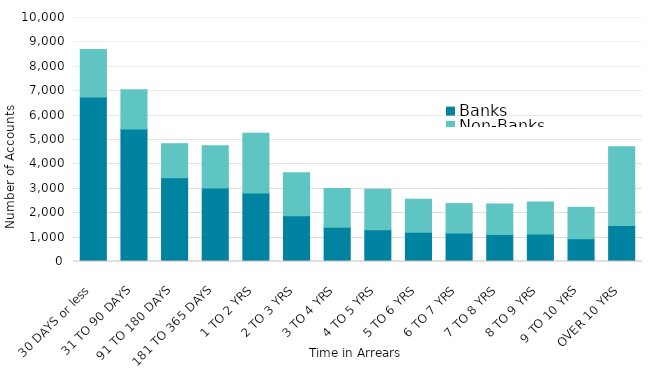
| Category | Banks | Non-Banks |
|---|---|---|
| 30 DAYS or less | 6746 | 1941 |
| 31 TO 90 DAYS | 5427 | 1617 |
| 91 TO 180 DAYS | 3435 | 1393 |
| 181 TO 365 DAYS | 3014 | 1731 |
| 1 TO 2 YRS | 2812 | 2448 |
| 2 TO 3 YRS | 1872 | 1763 |
| 3 TO 4 YRS | 1408 | 1583 |
| 4 TO 5 YRS | 1301 | 1664 |
| 5 TO 6 YRS | 1203 | 1345 |
| 6 TO 7 YRS | 1166 | 1206 |
| 7 TO 8 YRS | 1105 | 1253 |
| 8 TO 9 YRS | 1126 | 1313 |
| 9 TO 10 YRS | 933 | 1286 |
| OVER 10 YRS | 1473 | 3228 |